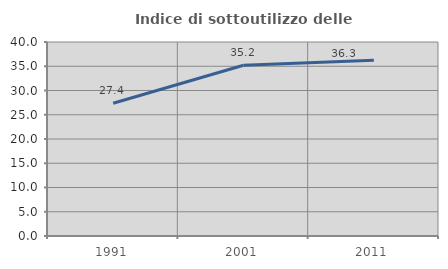
| Category | Indice di sottoutilizzo delle abitazioni  |
|---|---|
| 1991.0 | 27.368 |
| 2001.0 | 35.217 |
| 2011.0 | 36.251 |